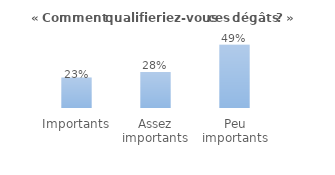
| Category | Series 0 |
|---|---|
| Importants | 0.234 |
| Assez importants | 0.276 |
| Peu importants | 0.487 |